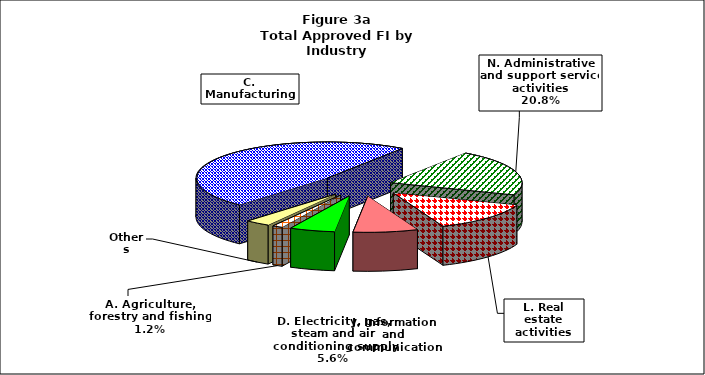
| Category | Series 0 |
|---|---|
| C. Manufacturing | 8791.856 |
| N. Administrative and support service activities | 3816.6 |
| L. Real estate activities | 2436.496 |
| J. Information and communication | 1459.069 |
| D. Electricity, gas, steam and air conditioning supply | 1020.864 |
| A. Agriculture, forestry and fishing | 228 |
| Others | 560.621 |